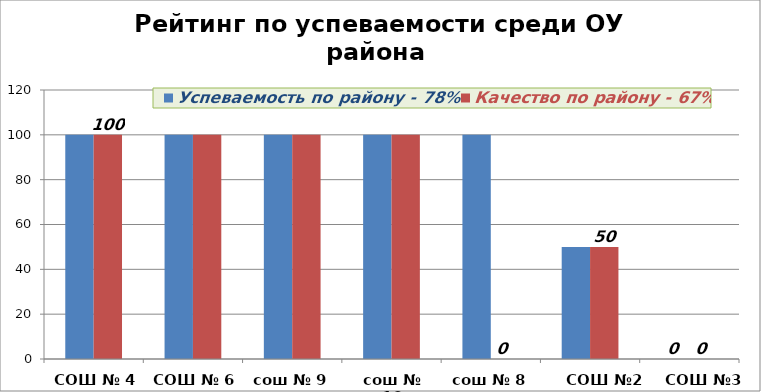
| Category | Успеваемость по району - 78% | Качество по району - 67% |
|---|---|---|
| СОШ № 4 | 100 | 100 |
| СОШ № 6 | 100 | 100 |
| сош № 9 | 100 | 100 |
| сош № 16 | 100 | 100 |
| сош № 8 | 100 | 0 |
| СОШ №2 | 50 | 50 |
| СОШ №3 | 0 | 0 |